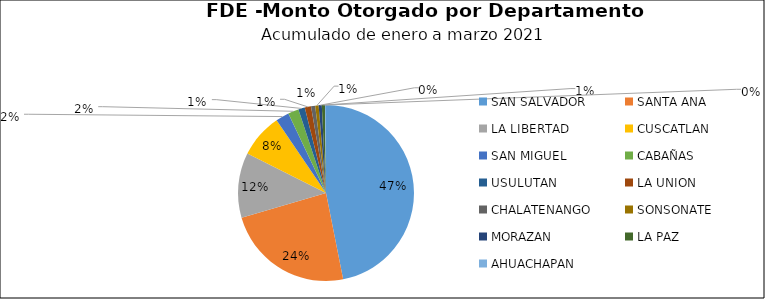
| Category | Monto | Créditos |
|---|---|---|
| SAN SALVADOR | 2.433 | 46 |
| SANTA ANA | 1.225 | 9 |
| LA LIBERTAD | 0.619 | 16 |
| CUSCATLAN | 0.421 | 4 |
| SAN MIGUEL | 0.127 | 4 |
| CABAÑAS | 0.102 | 2 |
| USULUTAN | 0.062 | 2 |
| LA UNION | 0.06 | 1 |
| CHALATENANGO | 0.04 | 1 |
| SONSONATE | 0.033 | 2 |
| MORAZAN | 0.03 | 1 |
| LA PAZ | 0.03 | 1 |
| AHUACHAPAN | 0.01 | 1 |